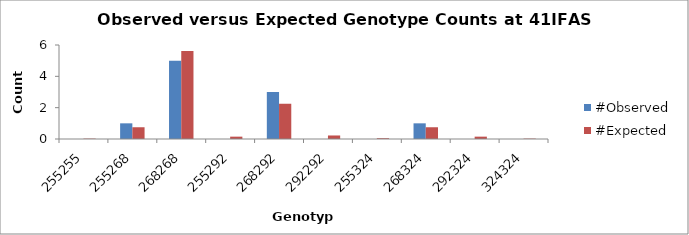
| Category | #Observed | #Expected |
|---|---|---|
| 255255.0 | 0 | 0.025 |
| 255268.0 | 1 | 0.75 |
| 268268.0 | 5 | 5.625 |
| 255292.0 | 0 | 0.15 |
| 268292.0 | 3 | 2.25 |
| 292292.0 | 0 | 0.225 |
| 255324.0 | 0 | 0.05 |
| 268324.0 | 1 | 0.75 |
| 292324.0 | 0 | 0.15 |
| 324324.0 | 0 | 0.025 |